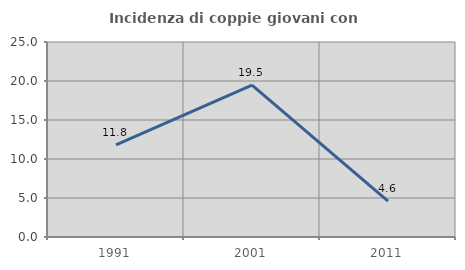
| Category | Incidenza di coppie giovani con figli |
|---|---|
| 1991.0 | 11.818 |
| 2001.0 | 19.481 |
| 2011.0 | 4.605 |